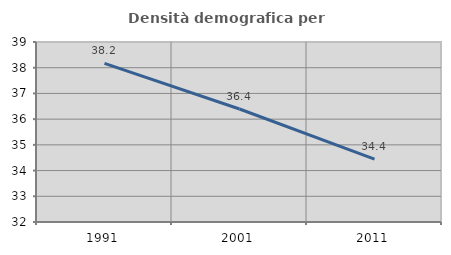
| Category | Densità demografica |
|---|---|
| 1991.0 | 38.167 |
| 2001.0 | 36.396 |
| 2011.0 | 34.447 |